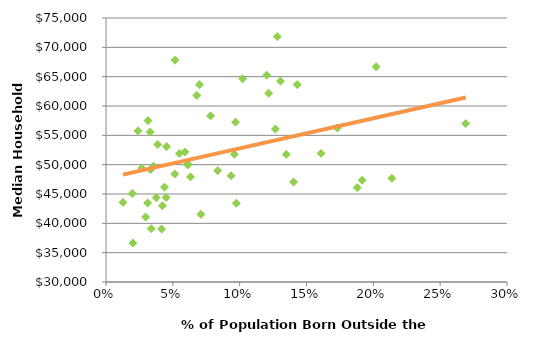
| Category | Series 0 |
|---|---|
| 0.031218542326260198 | 43464.214 |
| 0.06993684795260519 | 63647.97 |
| 0.1402982332031187 | 47043.73 |
| 0.04161034106836941 | 39018.207 |
| 0.2691101244792442 | 57019.523 |
| 0.09684366260755763 | 57254.884 |
| 0.13060755685719874 | 64247.281 |
| 0.08364157709332724 | 48971.893 |
| 0.12025207743760183 | 65246.2 |
| 0.18794620920986543 | 46071.019 |
| 0.09363732246667611 | 48120.925 |
| 0.17312446628957565 | 56262.527 |
| 0.06316595732568422 | 47921.74 |
| 0.13483407070992096 | 51737.543 |
| 0.043799167163959284 | 46158.026 |
| 0.038619189675573005 | 53442.415 |
| 0.060754654461716504 | 50002.501 |
| 0.02966380342842202 | 41086.49 |
| 0.03383780684031169 | 39084.677 |
| 0.033344433479152336 | 49157.959 |
| 0.1281520869104153 | 71835.585 |
| 0.1430685604057397 | 63655.897 |
| 0.061597574336789765 | 50014.804 |
| 0.06789715193929606 | 61794.916 |
| 0.02016872651588959 | 36641.3 |
| 0.03555693619124922 | 49764.262 |
| 0.019804325997524075 | 45088.434 |
| 0.0591031391132915 | 52196.224 |
| 0.19163401858056023 | 47333.251 |
| 0.05168601249457373 | 67818.752 |
| 0.20205782441827616 | 66692.485 |
| 0.09753138697826659 | 43424.182 |
| 0.21381061070535543 | 47680.251 |
| 0.07091762354166196 | 41553.374 |
| 0.023889840517961055 | 55765.907 |
| 0.03754165531383838 | 44375.11 |
| 0.05148858843791107 | 48406.856 |
| 0.09598403620606866 | 51775.459 |
| 0.054839728493196266 | 51904.073 |
| 0.1267155901630161 | 56065.314 |
| 0.04497305777680728 | 44401.061 |
| 0.0267915502909342 | 49414.798 |
| 0.04219302461431829 | 42995.045 |
| 0.1608098795664745 | 51926.141 |
| 0.07833950783100599 | 58341.015 |
| 0.03303042974781266 | 55581.826 |
| 0.10221792583402156 | 64631.518 |
| 0.12164064827034624 | 62186.634 |
| 0.012709799057796642 | 43553.124 |
| 0.04528651366084657 | 53079.006 |
| 0.031432928509747 | 57512.159 |